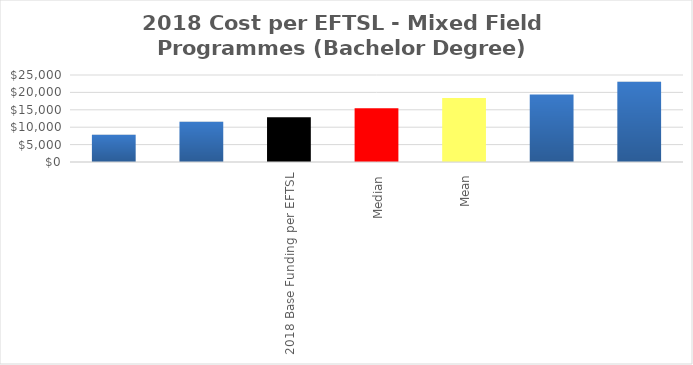
| Category | Series 0 |
|---|---|
|  | 7828.963 |
|  | 11535.814 |
| 2018 Base Funding per EFTSL | 12874 |
| Median | 15477.967 |
| Mean | 18404.649 |